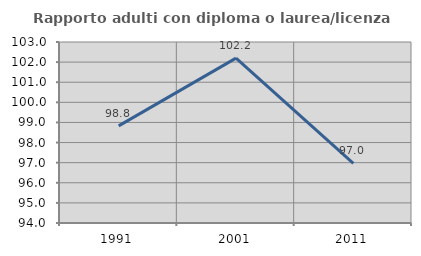
| Category | Rapporto adulti con diploma o laurea/licenza media  |
|---|---|
| 1991.0 | 98.83 |
| 2001.0 | 102.198 |
| 2011.0 | 96.97 |